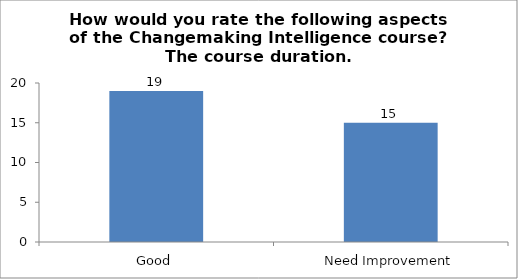
| Category | How would you rate the following aspects of the Changemaking Intelligence course?
The course duration. |
|---|---|
| Good | 19 |
| Need Improvement | 15 |